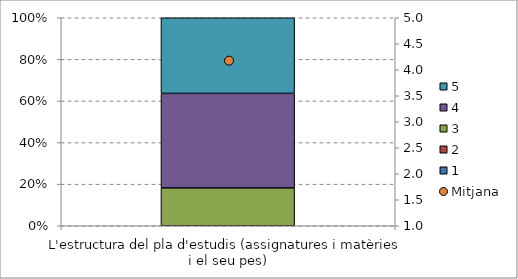
| Category | 1 | 2 | 3 | 4 | 5 |
|---|---|---|---|---|---|
| L'estructura del pla d'estudis (assignatures i matèries i el seu pes) | 0 | 0 | 0.182 | 0.454 | 0.364 |